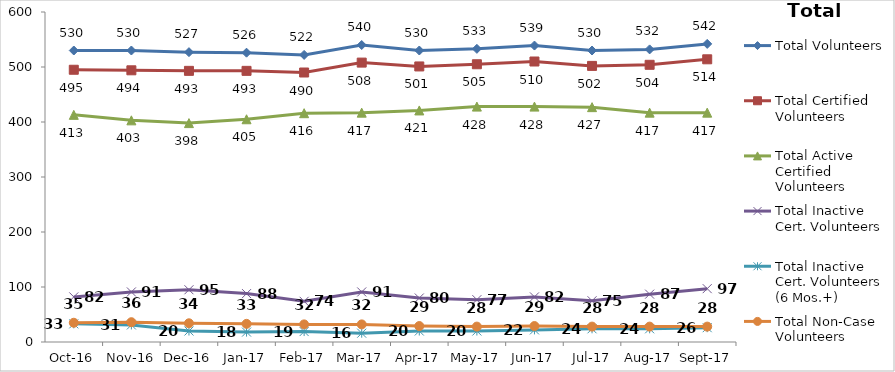
| Category | Total Volunteers | Total Certified Volunteers | Total Active Certified Volunteers | Total Inactive Cert. Volunteers | Total Inactive Cert. Volunteers (6 Mos.+) | Total Non-Case Volunteers |
|---|---|---|---|---|---|---|
| 2016-10-01 | 530 | 495 | 413 | 82 | 33 | 35 |
| 2016-11-01 | 530 | 494 | 403 | 91 | 31 | 36 |
| 2016-12-01 | 527 | 493 | 398 | 95 | 20 | 34 |
| 2017-01-01 | 526 | 493 | 405 | 88 | 18 | 33 |
| 2017-02-01 | 522 | 490 | 416 | 74 | 19 | 32 |
| 2017-03-01 | 540 | 508 | 417 | 91 | 16 | 32 |
| 2017-04-01 | 530 | 501 | 421 | 80 | 20 | 29 |
| 2017-05-01 | 533 | 505 | 428 | 77 | 20 | 28 |
| 2017-06-01 | 539 | 510 | 428 | 82 | 22 | 29 |
| 2017-07-01 | 530 | 502 | 427 | 75 | 24 | 28 |
| 2017-08-01 | 532 | 504 | 417 | 87 | 24 | 28 |
| 2017-09-01 | 542 | 514 | 417 | 97 | 26 | 28 |